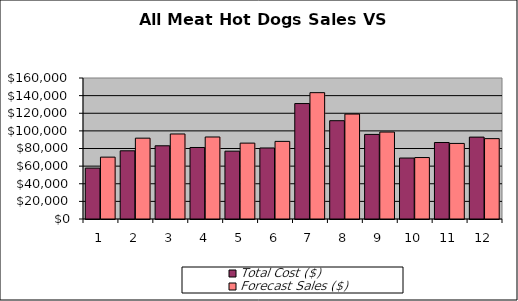
| Category | Total Cost ($) | Forecast Sales ($) |
|---|---|---|
| 0 | 57774.857 | 70200 |
| 1 | 77376 | 91728 |
| 2 | 83080 | 96480 |
| 3 | 81141.429 | 93060 |
| 4 | 76974 | 86112 |
| 5 | 80600 | 88075 |
| 6 | 130995.393 | 143365 |
| 7 | 111544.286 | 119080 |
| 8 | 95976 | 98685 |
| 9 | 69175.714 | 69750 |
| 10 | 86800 | 85750 |
| 11 | 92918.571 | 91200 |